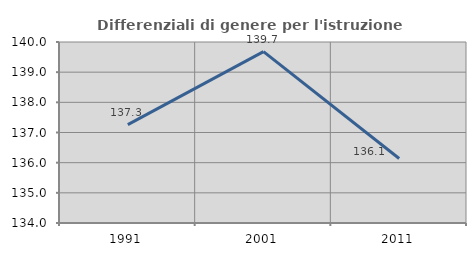
| Category | Differenziali di genere per l'istruzione superiore |
|---|---|
| 1991.0 | 137.263 |
| 2001.0 | 139.682 |
| 2011.0 | 136.137 |